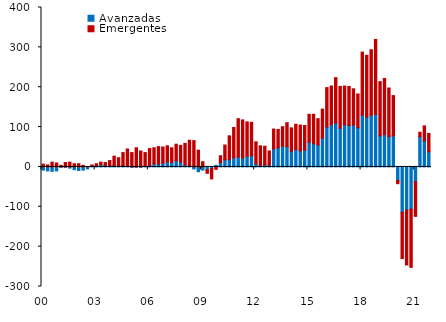
| Category | Avanzadas | Emergentes |
|---|---|---|
| 00 | -8 | 7 |
| II | -10 | 5 |
| III | -11 | 12 |
| IV | -10 | 10 |
| 01 | -1 | 4 |
| II | -1 | 11 |
| III | -3 | 12 |
| IV | -7 | 8 |
| 02 | -9 | 8 |
| II | -8 | 4 |
| III | -5 | 1 |
| IV | 2 | 3 |
| 03 | 3 | 5 |
| II | 6 | 6 |
| III | 4 | 7 |
| IV | 3 | 13 |
| 04 | 4 | 23 |
| II | 1 | 22 |
| III | 3 | 33 |
| IV | 1 | 44 |
| 05 | -1 | 36 |
| II | -1 | 48 |
| III | -1 | 40 |
| IV | 1 | 35 |
| 06 | 4 | 42 |
| II | 8 | 40 |
| III | 7 | 44 |
| IV | 9 | 41 |
| 07 | 13 | 40 |
| II | 11 | 37 |
| III | 16 | 41 |
| IV | 12 | 42 |
| 08 | 5 | 54 |
| II | 2 | 65 |
| III | -5 | 66 |
| IV | -12 | 42 |
| 09 | -8 | 13 |
| II | -7 | -9 |
| III | -4 | -26 |
| IV | 4 | -6 |
| 10 | 11 | 17 |
| II | 18 | 37 |
| III | 18 | 60 |
| IV | 23 | 76 |
| 11 | 25 | 96 |
| II | 22 | 96 |
| III | 27 | 86 |
| IV | 28 | 84 |
| 12 | 8 | 55 |
| II | 4 | 49 |
| III | 5 | 47 |
| IV | 5 | 35 |
| 13 | 45 | 50 |
| II | 48 | 46 |
| III | 52 | 49 |
| IV | 51 | 60 |
| 14 | 39 | 59 |
| II | 44 | 63 |
| III | 40 | 65 |
| IV | 42 | 62 |
| 15 | 62 | 70 |
| II | 58 | 74 |
| III | 55 | 66 |
| IV | 72 | 73 |
| 16 | 100 | 99 |
| II | 106 | 97 |
| III | 110 | 114 |
| IV | 97 | 105 |
| 17 | 106 | 97 |
| II | 104 | 98 |
| III | 105 | 91 |
| IV | 98 | 85 |
| 18 | 130 | 158 |
| II | 125 | 155 |
| III | 130 | 164 |
| IV | 132 | 188 |
| 19 | 78 | 136 |
| II | 81 | 141 |
| III | 76 | 122 |
| IV | 78 | 101 |
| 20 | -34 | -8 |
| II | -114 | -116 |
| III | -108 | -138 |
| IV | -106 | -146 |
| 21 | -37 | -87 |
| II | 76 | 11 |
| III | 65 | 38 |
| IV | 38 | 46 |